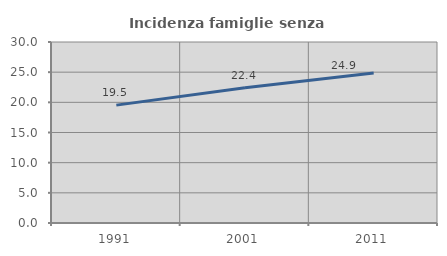
| Category | Incidenza famiglie senza nuclei |
|---|---|
| 1991.0 | 19.537 |
| 2001.0 | 22.421 |
| 2011.0 | 24.867 |